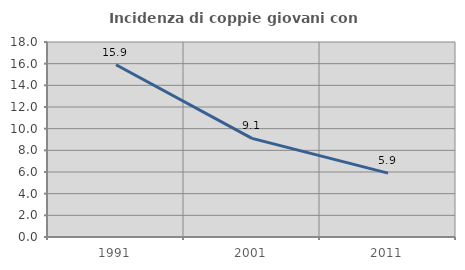
| Category | Incidenza di coppie giovani con figli |
|---|---|
| 1991.0 | 15.902 |
| 2001.0 | 9.107 |
| 2011.0 | 5.893 |